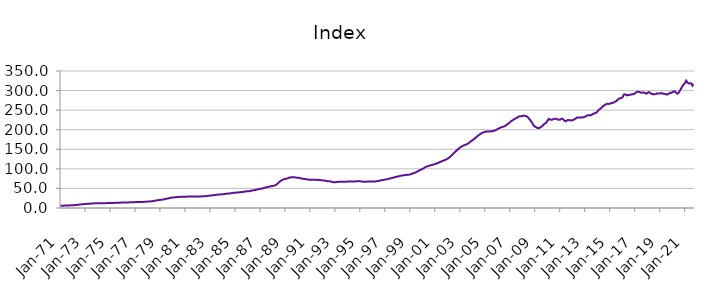
| Category | Index |
|---|---|
| 1971-01-01 | 5.879 |
| 1971-02-01 | 5.921 |
| 1971-03-01 | 5.963 |
| 1971-04-01 | 6.018 |
| 1971-05-01 | 6.108 |
| 1971-06-01 | 6.203 |
| 1971-07-01 | 6.32 |
| 1971-08-01 | 6.446 |
| 1971-09-01 | 6.572 |
| 1971-10-01 | 6.703 |
| 1971-11-01 | 6.844 |
| 1971-12-01 | 7.015 |
| 1972-01-01 | 7.135 |
| 1972-02-01 | 7.213 |
| 1972-03-01 | 7.39 |
| 1972-04-01 | 7.638 |
| 1972-05-01 | 7.997 |
| 1972-06-01 | 8.312 |
| 1972-07-01 | 8.674 |
| 1972-08-01 | 9.023 |
| 1972-09-01 | 9.332 |
| 1972-10-01 | 9.62 |
| 1972-11-01 | 9.887 |
| 1972-12-01 | 10.162 |
| 1973-01-01 | 10.359 |
| 1973-02-01 | 10.498 |
| 1973-03-01 | 10.658 |
| 1973-04-01 | 10.841 |
| 1973-05-01 | 11.075 |
| 1973-06-01 | 11.227 |
| 1973-07-01 | 11.386 |
| 1973-08-01 | 11.562 |
| 1973-09-01 | 11.768 |
| 1973-10-01 | 11.982 |
| 1973-11-01 | 12.145 |
| 1973-12-01 | 12.262 |
| 1974-01-01 | 12.324 |
| 1974-02-01 | 12.392 |
| 1974-03-01 | 12.389 |
| 1974-04-01 | 12.362 |
| 1974-05-01 | 12.339 |
| 1974-06-01 | 12.34 |
| 1974-07-01 | 12.352 |
| 1974-08-01 | 12.392 |
| 1974-09-01 | 12.465 |
| 1974-10-01 | 12.555 |
| 1974-11-01 | 12.63 |
| 1974-12-01 | 12.703 |
| 1975-01-01 | 12.737 |
| 1975-02-01 | 12.78 |
| 1975-03-01 | 12.857 |
| 1975-04-01 | 12.965 |
| 1975-05-01 | 13.097 |
| 1975-06-01 | 13.168 |
| 1975-07-01 | 13.237 |
| 1975-08-01 | 13.332 |
| 1975-09-01 | 13.462 |
| 1975-10-01 | 13.606 |
| 1975-11-01 | 13.732 |
| 1975-12-01 | 13.867 |
| 1976-01-01 | 13.963 |
| 1976-02-01 | 14.052 |
| 1976-03-01 | 14.114 |
| 1976-04-01 | 14.179 |
| 1976-05-01 | 14.264 |
| 1976-06-01 | 14.32 |
| 1976-07-01 | 14.382 |
| 1976-08-01 | 14.474 |
| 1976-09-01 | 14.605 |
| 1976-10-01 | 14.752 |
| 1976-11-01 | 14.87 |
| 1976-12-01 | 14.976 |
| 1977-01-01 | 15.034 |
| 1977-02-01 | 15.102 |
| 1977-03-01 | 15.145 |
| 1977-04-01 | 15.197 |
| 1977-05-01 | 15.276 |
| 1977-06-01 | 15.347 |
| 1977-07-01 | 15.436 |
| 1977-08-01 | 15.557 |
| 1977-09-01 | 15.705 |
| 1977-10-01 | 15.871 |
| 1977-11-01 | 16.048 |
| 1977-12-01 | 16.278 |
| 1978-01-01 | 16.449 |
| 1978-02-01 | 16.582 |
| 1978-03-01 | 16.762 |
| 1978-04-01 | 17.003 |
| 1978-05-01 | 17.391 |
| 1978-06-01 | 17.783 |
| 1978-07-01 | 18.258 |
| 1978-08-01 | 18.744 |
| 1978-09-01 | 19.213 |
| 1978-10-01 | 19.678 |
| 1978-11-01 | 20.113 |
| 1978-12-01 | 20.542 |
| 1979-01-01 | 20.797 |
| 1979-02-01 | 20.968 |
| 1979-03-01 | 21.394 |
| 1979-04-01 | 21.979 |
| 1979-05-01 | 22.725 |
| 1979-06-01 | 23.198 |
| 1979-07-01 | 23.69 |
| 1979-08-01 | 24.243 |
| 1979-09-01 | 24.906 |
| 1979-10-01 | 25.613 |
| 1979-11-01 | 26.202 |
| 1979-12-01 | 26.66 |
| 1980-01-01 | 26.911 |
| 1980-02-01 | 27.107 |
| 1980-03-01 | 27.357 |
| 1980-04-01 | 27.651 |
| 1980-05-01 | 27.994 |
| 1980-06-01 | 28.178 |
| 1980-07-01 | 28.344 |
| 1980-08-01 | 28.498 |
| 1980-09-01 | 28.607 |
| 1980-10-01 | 28.676 |
| 1980-11-01 | 28.73 |
| 1980-12-01 | 28.843 |
| 1981-01-01 | 28.911 |
| 1981-02-01 | 29.013 |
| 1981-03-01 | 29.116 |
| 1981-04-01 | 29.254 |
| 1981-05-01 | 29.394 |
| 1981-06-01 | 29.441 |
| 1981-07-01 | 29.464 |
| 1981-08-01 | 29.469 |
| 1981-09-01 | 29.414 |
| 1981-10-01 | 29.312 |
| 1981-11-01 | 29.219 |
| 1981-12-01 | 29.209 |
| 1982-01-01 | 29.164 |
| 1982-02-01 | 29.184 |
| 1982-03-01 | 29.346 |
| 1982-04-01 | 29.618 |
| 1982-05-01 | 29.924 |
| 1982-06-01 | 30.035 |
| 1982-07-01 | 30.119 |
| 1982-08-01 | 30.28 |
| 1982-09-01 | 30.54 |
| 1982-10-01 | 30.849 |
| 1982-11-01 | 31.157 |
| 1982-12-01 | 31.538 |
| 1983-01-01 | 31.828 |
| 1983-02-01 | 32.078 |
| 1983-03-01 | 32.337 |
| 1983-04-01 | 32.659 |
| 1983-05-01 | 33.081 |
| 1983-06-01 | 33.413 |
| 1983-07-01 | 33.773 |
| 1983-08-01 | 34.116 |
| 1983-09-01 | 34.39 |
| 1983-10-01 | 34.614 |
| 1983-11-01 | 34.826 |
| 1983-12-01 | 35.104 |
| 1984-01-01 | 35.27 |
| 1984-02-01 | 35.438 |
| 1984-03-01 | 35.758 |
| 1984-04-01 | 36.202 |
| 1984-05-01 | 36.71 |
| 1984-06-01 | 36.936 |
| 1984-07-01 | 37.124 |
| 1984-08-01 | 37.411 |
| 1984-09-01 | 37.87 |
| 1984-10-01 | 38.4 |
| 1984-11-01 | 38.81 |
| 1984-12-01 | 39.095 |
| 1985-01-01 | 39.174 |
| 1985-02-01 | 39.283 |
| 1985-03-01 | 39.552 |
| 1985-04-01 | 39.93 |
| 1985-05-01 | 40.361 |
| 1985-06-01 | 40.527 |
| 1985-07-01 | 40.681 |
| 1985-08-01 | 40.948 |
| 1985-09-01 | 41.393 |
| 1985-10-01 | 41.902 |
| 1985-11-01 | 42.329 |
| 1985-12-01 | 42.671 |
| 1986-01-01 | 42.803 |
| 1986-02-01 | 42.939 |
| 1986-03-01 | 43.335 |
| 1986-04-01 | 43.908 |
| 1986-05-01 | 44.624 |
| 1986-06-01 | 45.057 |
| 1986-07-01 | 45.499 |
| 1986-08-01 | 46.028 |
| 1986-09-01 | 46.692 |
| 1986-10-01 | 47.409 |
| 1986-11-01 | 48.06 |
| 1986-12-01 | 48.667 |
| 1987-01-01 | 49.02 |
| 1987-02-01 | 49.311 |
| 1987-03-01 | 49.944 |
| 1987-04-01 | 50.795 |
| 1987-05-01 | 51.813 |
| 1987-06-01 | 52.387 |
| 1987-07-01 | 52.937 |
| 1987-08-01 | 53.541 |
| 1987-09-01 | 54.197 |
| 1987-10-01 | 54.877 |
| 1987-11-01 | 55.513 |
| 1987-12-01 | 56.172 |
| 1988-01-01 | 56.486 |
| 1988-02-01 | 56.756 |
| 1988-03-01 | 57.701 |
| 1988-04-01 | 59.124 |
| 1988-05-01 | 61.264 |
| 1988-06-01 | 63.424 |
| 1988-07-01 | 65.968 |
| 1988-08-01 | 68.307 |
| 1988-09-01 | 70.109 |
| 1988-10-01 | 71.604 |
| 1988-11-01 | 72.807 |
| 1988-12-01 | 73.875 |
| 1989-01-01 | 74.434 |
| 1989-02-01 | 74.906 |
| 1989-03-01 | 75.707 |
| 1989-04-01 | 76.727 |
| 1989-05-01 | 77.807 |
| 1989-06-01 | 78.279 |
| 1989-07-01 | 78.601 |
| 1989-08-01 | 78.752 |
| 1989-09-01 | 78.622 |
| 1989-10-01 | 78.258 |
| 1989-11-01 | 77.774 |
| 1989-12-01 | 77.38 |
| 1990-01-01 | 77.025 |
| 1990-02-01 | 77.011 |
| 1990-03-01 | 76.482 |
| 1990-04-01 | 75.796 |
| 1990-05-01 | 74.994 |
| 1990-06-01 | 74.611 |
| 1990-07-01 | 74.285 |
| 1990-08-01 | 73.967 |
| 1990-09-01 | 73.52 |
| 1990-10-01 | 73.009 |
| 1990-11-01 | 72.535 |
| 1990-12-01 | 72.334 |
| 1991-01-01 | 72.192 |
| 1991-02-01 | 72.268 |
| 1991-03-01 | 72.153 |
| 1991-04-01 | 72.077 |
| 1991-05-01 | 71.977 |
| 1991-06-01 | 71.933 |
| 1991-07-01 | 71.885 |
| 1991-08-01 | 71.819 |
| 1991-09-01 | 71.705 |
| 1991-10-01 | 71.501 |
| 1991-11-01 | 71.166 |
| 1991-12-01 | 70.813 |
| 1992-01-01 | 70.463 |
| 1992-02-01 | 70.409 |
| 1992-03-01 | 69.918 |
| 1992-04-01 | 69.325 |
| 1992-05-01 | 68.671 |
| 1992-06-01 | 68.457 |
| 1992-07-01 | 68.303 |
| 1992-08-01 | 67.98 |
| 1992-09-01 | 67.29 |
| 1992-10-01 | 66.434 |
| 1992-11-01 | 65.854 |
| 1992-12-01 | 65.871 |
| 1993-01-01 | 66.034 |
| 1993-02-01 | 66.322 |
| 1993-03-01 | 66.581 |
| 1993-04-01 | 66.905 |
| 1993-05-01 | 67.182 |
| 1993-06-01 | 67.213 |
| 1993-07-01 | 67.233 |
| 1993-08-01 | 67.289 |
| 1993-09-01 | 67.247 |
| 1993-10-01 | 67.126 |
| 1993-11-01 | 67.046 |
| 1993-12-01 | 67.281 |
| 1994-01-01 | 67.604 |
| 1994-02-01 | 68.006 |
| 1994-03-01 | 67.991 |
| 1994-04-01 | 67.827 |
| 1994-05-01 | 67.683 |
| 1994-06-01 | 67.696 |
| 1994-07-01 | 67.777 |
| 1994-08-01 | 67.944 |
| 1994-09-01 | 68.21 |
| 1994-10-01 | 68.532 |
| 1994-11-01 | 68.685 |
| 1994-12-01 | 68.595 |
| 1995-01-01 | 68.092 |
| 1995-02-01 | 67.66 |
| 1995-03-01 | 67.497 |
| 1995-04-01 | 67.327 |
| 1995-05-01 | 67.356 |
| 1995-06-01 | 67.213 |
| 1995-07-01 | 67.36 |
| 1995-08-01 | 67.425 |
| 1995-09-01 | 67.463 |
| 1995-10-01 | 67.439 |
| 1995-11-01 | 67.524 |
| 1995-12-01 | 67.607 |
| 1996-01-01 | 67.632 |
| 1996-02-01 | 67.59 |
| 1996-03-01 | 67.814 |
| 1996-04-01 | 68.077 |
| 1996-05-01 | 68.578 |
| 1996-06-01 | 68.945 |
| 1996-07-01 | 69.543 |
| 1996-08-01 | 70.122 |
| 1996-09-01 | 70.708 |
| 1996-10-01 | 71.134 |
| 1996-11-01 | 71.585 |
| 1996-12-01 | 72.224 |
| 1997-01-01 | 72.682 |
| 1997-02-01 | 73.17 |
| 1997-03-01 | 73.587 |
| 1997-04-01 | 74.264 |
| 1997-05-01 | 75.148 |
| 1997-06-01 | 75.819 |
| 1997-07-01 | 76.292 |
| 1997-08-01 | 77.048 |
| 1997-09-01 | 77.723 |
| 1997-10-01 | 78.598 |
| 1997-11-01 | 79.21 |
| 1997-12-01 | 79.988 |
| 1998-01-01 | 80.449 |
| 1998-02-01 | 81.141 |
| 1998-03-01 | 81.745 |
| 1998-04-01 | 82.495 |
| 1998-05-01 | 83.027 |
| 1998-06-01 | 83.355 |
| 1998-07-01 | 83.747 |
| 1998-08-01 | 84.113 |
| 1998-09-01 | 84.484 |
| 1998-10-01 | 84.731 |
| 1998-11-01 | 85.018 |
| 1998-12-01 | 85.363 |
| 1999-01-01 | 85.875 |
| 1999-02-01 | 86.896 |
| 1999-03-01 | 87.796 |
| 1999-04-01 | 88.688 |
| 1999-05-01 | 89.666 |
| 1999-06-01 | 90.701 |
| 1999-07-01 | 91.918 |
| 1999-08-01 | 93.495 |
| 1999-09-01 | 95.101 |
| 1999-10-01 | 96.577 |
| 1999-11-01 | 97.58 |
| 1999-12-01 | 98.926 |
| 2000-01-01 | 100 |
| 2000-02-01 | 101.936 |
| 2000-03-01 | 103.455 |
| 2000-04-01 | 105.075 |
| 2000-05-01 | 105.895 |
| 2000-06-01 | 106.901 |
| 2000-07-01 | 107.798 |
| 2000-08-01 | 108.633 |
| 2000-09-01 | 109.409 |
| 2000-10-01 | 110.207 |
| 2000-11-01 | 110.863 |
| 2000-12-01 | 111.699 |
| 2001-01-01 | 112.376 |
| 2001-02-01 | 113.427 |
| 2001-03-01 | 114.41 |
| 2001-04-01 | 115.617 |
| 2001-05-01 | 116.92 |
| 2001-06-01 | 118 |
| 2001-07-01 | 119.178 |
| 2001-08-01 | 120.352 |
| 2001-09-01 | 121.415 |
| 2001-10-01 | 122.129 |
| 2001-11-01 | 123.346 |
| 2001-12-01 | 124.695 |
| 2002-01-01 | 126.498 |
| 2002-02-01 | 128.249 |
| 2002-03-01 | 130.341 |
| 2002-04-01 | 132.594 |
| 2002-05-01 | 135.137 |
| 2002-06-01 | 137.714 |
| 2002-07-01 | 140.534 |
| 2002-08-01 | 143.04 |
| 2002-09-01 | 145.7 |
| 2002-10-01 | 148.191 |
| 2002-11-01 | 150.379 |
| 2002-12-01 | 152.788 |
| 2003-01-01 | 154.938 |
| 2003-02-01 | 156.702 |
| 2003-03-01 | 158.127 |
| 2003-04-01 | 159.492 |
| 2003-05-01 | 160.649 |
| 2003-06-01 | 161.58 |
| 2003-07-01 | 162.401 |
| 2003-08-01 | 164.014 |
| 2003-09-01 | 165.699 |
| 2003-10-01 | 167.901 |
| 2003-11-01 | 170.039 |
| 2003-12-01 | 171.829 |
| 2004-01-01 | 173.609 |
| 2004-02-01 | 175.589 |
| 2004-03-01 | 177.991 |
| 2004-04-01 | 180.138 |
| 2004-05-01 | 182.465 |
| 2004-06-01 | 184.54 |
| 2004-07-01 | 186.551 |
| 2004-08-01 | 188.625 |
| 2004-09-01 | 190.257 |
| 2004-10-01 | 192.019 |
| 2004-11-01 | 192.962 |
| 2004-12-01 | 193.904 |
| 2005-01-01 | 194.627 |
| 2005-02-01 | 195.72 |
| 2005-03-01 | 195.655 |
| 2005-04-01 | 195.754 |
| 2005-05-01 | 195.194 |
| 2005-06-01 | 195.793 |
| 2005-07-01 | 195.867 |
| 2005-08-01 | 196.175 |
| 2005-09-01 | 196.736 |
| 2005-10-01 | 197.938 |
| 2005-11-01 | 198.884 |
| 2005-12-01 | 200.645 |
| 2006-01-01 | 201.661 |
| 2006-02-01 | 203.374 |
| 2006-03-01 | 204.511 |
| 2006-04-01 | 205.861 |
| 2006-05-01 | 206.826 |
| 2006-06-01 | 207.511 |
| 2006-07-01 | 208.388 |
| 2006-08-01 | 209.567 |
| 2006-09-01 | 211.353 |
| 2006-10-01 | 213.443 |
| 2006-11-01 | 215.14 |
| 2006-12-01 | 217.475 |
| 2007-01-01 | 219.496 |
| 2007-02-01 | 222.231 |
| 2007-03-01 | 223.7 |
| 2007-04-01 | 225.58 |
| 2007-05-01 | 226.869 |
| 2007-06-01 | 228.812 |
| 2007-07-01 | 229.701 |
| 2007-08-01 | 231.63 |
| 2007-09-01 | 233.384 |
| 2007-10-01 | 234.664 |
| 2007-11-01 | 234.312 |
| 2007-12-01 | 234.555 |
| 2008-01-01 | 235.086 |
| 2008-02-01 | 236.026 |
| 2008-03-01 | 235.364 |
| 2008-04-01 | 234.965 |
| 2008-05-01 | 233.6 |
| 2008-06-01 | 231.702 |
| 2008-07-01 | 228.29 |
| 2008-08-01 | 225.152 |
| 2008-09-01 | 221.485 |
| 2008-10-01 | 217.485 |
| 2008-11-01 | 212.758 |
| 2008-12-01 | 209.323 |
| 2009-01-01 | 207.652 |
| 2009-02-01 | 206.212 |
| 2009-03-01 | 204.576 |
| 2009-04-01 | 203.86 |
| 2009-05-01 | 204.572 |
| 2009-06-01 | 206.247 |
| 2009-07-01 | 207.906 |
| 2009-08-01 | 210.209 |
| 2009-09-01 | 213.072 |
| 2009-10-01 | 215.548 |
| 2009-11-01 | 216.169 |
| 2009-12-01 | 220.435 |
| 2010-01-01 | 223.882 |
| 2010-02-01 | 227.544 |
| 2010-03-01 | 226.207 |
| 2010-04-01 | 225.371 |
| 2010-05-01 | 225.616 |
| 2010-06-01 | 226.496 |
| 2010-07-01 | 227.242 |
| 2010-08-01 | 228.031 |
| 2010-09-01 | 227.934 |
| 2010-10-01 | 227.086 |
| 2010-11-01 | 225.565 |
| 2010-12-01 | 225.596 |
| 2011-01-01 | 226.214 |
| 2011-02-01 | 228.039 |
| 2011-03-01 | 228.503 |
| 2011-04-01 | 226.162 |
| 2011-05-01 | 223.102 |
| 2011-06-01 | 221.419 |
| 2011-07-01 | 222.781 |
| 2011-08-01 | 224.513 |
| 2011-09-01 | 224.472 |
| 2011-10-01 | 224.841 |
| 2011-11-01 | 223.579 |
| 2011-12-01 | 223.822 |
| 2012-01-01 | 224.584 |
| 2012-02-01 | 225.473 |
| 2012-03-01 | 227.466 |
| 2012-04-01 | 228.575 |
| 2012-05-01 | 231.11 |
| 2012-06-01 | 231.251 |
| 2012-07-01 | 231.282 |
| 2012-08-01 | 230.612 |
| 2012-09-01 | 231.126 |
| 2012-10-01 | 231.503 |
| 2012-11-01 | 231.747 |
| 2012-12-01 | 232.346 |
| 2013-01-01 | 233.26 |
| 2013-02-01 | 235.199 |
| 2013-03-01 | 236.287 |
| 2013-04-01 | 236.897 |
| 2013-05-01 | 236.822 |
| 2013-06-01 | 237.016 |
| 2013-07-01 | 237.888 |
| 2013-08-01 | 239.493 |
| 2013-09-01 | 240.786 |
| 2013-10-01 | 242.115 |
| 2013-11-01 | 242.898 |
| 2013-12-01 | 244.057 |
| 2014-01-01 | 247.816 |
| 2014-02-01 | 250.169 |
| 2014-03-01 | 252.769 |
| 2014-04-01 | 254.326 |
| 2014-05-01 | 257.246 |
| 2014-06-01 | 260.069 |
| 2014-07-01 | 261.53 |
| 2014-08-01 | 263.472 |
| 2014-09-01 | 264.905 |
| 2014-10-01 | 266.07 |
| 2014-11-01 | 266.347 |
| 2014-12-01 | 265.659 |
| 2015-01-01 | 266.928 |
| 2015-02-01 | 267.88 |
| 2015-03-01 | 268.307 |
| 2015-04-01 | 269.155 |
| 2015-05-01 | 270.34 |
| 2015-06-01 | 272.163 |
| 2015-07-01 | 273.277 |
| 2015-08-01 | 276.288 |
| 2015-09-01 | 278.116 |
| 2015-10-01 | 280.486 |
| 2015-11-01 | 280.294 |
| 2015-12-01 | 281.199 |
| 2016-01-01 | 283.607 |
| 2016-02-01 | 289.619 |
| 2016-03-01 | 290.057 |
| 2016-04-01 | 289.886 |
| 2016-05-01 | 287.681 |
| 2016-06-01 | 288.483 |
| 2016-07-01 | 288.661 |
| 2016-08-01 | 289.259 |
| 2016-09-01 | 289.711 |
| 2016-10-01 | 290.701 |
| 2016-11-01 | 290.463 |
| 2016-12-01 | 291.375 |
| 2017-01-01 | 293.717 |
| 2017-02-01 | 295.456 |
| 2017-03-01 | 297.078 |
| 2017-04-01 | 296.912 |
| 2017-05-01 | 296.553 |
| 2017-06-01 | 295.078 |
| 2017-07-01 | 294.677 |
| 2017-08-01 | 294.669 |
| 2017-09-01 | 295.305 |
| 2017-10-01 | 294.345 |
| 2017-11-01 | 293.162 |
| 2017-12-01 | 292.069 |
| 2018-01-01 | 294.449 |
| 2018-02-01 | 295.846 |
| 2018-03-01 | 294.92 |
| 2018-04-01 | 292.924 |
| 2018-05-01 | 291.472 |
| 2018-06-01 | 291.002 |
| 2018-07-01 | 290.236 |
| 2018-08-01 | 290.758 |
| 2018-09-01 | 291.058 |
| 2018-10-01 | 292.824 |
| 2018-11-01 | 292.65 |
| 2018-12-01 | 292.367 |
| 2019-01-01 | 292.519 |
| 2019-02-01 | 293.9 |
| 2019-03-01 | 292.871 |
| 2019-04-01 | 291.841 |
| 2019-05-01 | 291.513 |
| 2019-06-01 | 290.998 |
| 2019-07-01 | 290.148 |
| 2019-08-01 | 289.99 |
| 2019-09-01 | 291.573 |
| 2019-10-01 | 293.571 |
| 2019-11-01 | 294.348 |
| 2019-12-01 | 294.551 |
| 2020-01-01 | 295.866 |
| 2020-02-01 | 298.222 |
| 2020-03-01 | 298.209 |
| 2020-04-01 | 295.219 |
| 2020-05-01 | 292.362 |
| 2020-06-01 | 292.368 |
| 2020-07-01 | 295.543 |
| 2020-08-01 | 300.082 |
| 2020-09-01 | 304.427 |
| 2020-10-01 | 309.885 |
| 2020-11-01 | 313.48 |
| 2020-12-01 | 317.137 |
| 2021-01-01 | 319.851 |
| 2021-02-01 | 325.52 |
| 2021-03-01 | 321.581 |
| 2021-04-01 | 318.37 |
| 2021-05-01 | 319.163 |
| 2021-06-01 | 317.911 |
| 2021-07-01 | 318.284 |
| 2021-08-01 | 312.562 |
| 2021-09-01 | 316.354 |